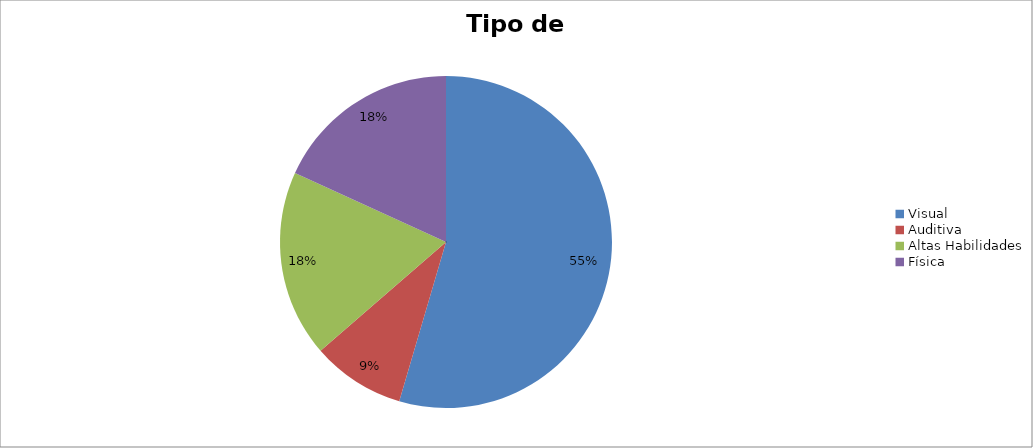
| Category | Quantitativo |
|---|---|
| Visual | 6 |
| Auditiva | 1 |
| Altas Habilidades | 2 |
| Física | 2 |